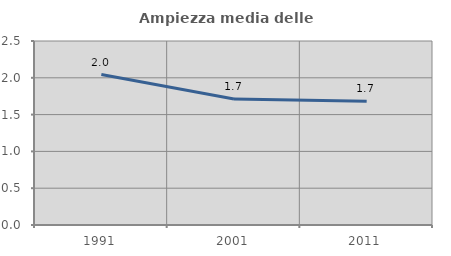
| Category | Ampiezza media delle famiglie |
|---|---|
| 1991.0 | 2.044 |
| 2001.0 | 1.713 |
| 2011.0 | 1.681 |